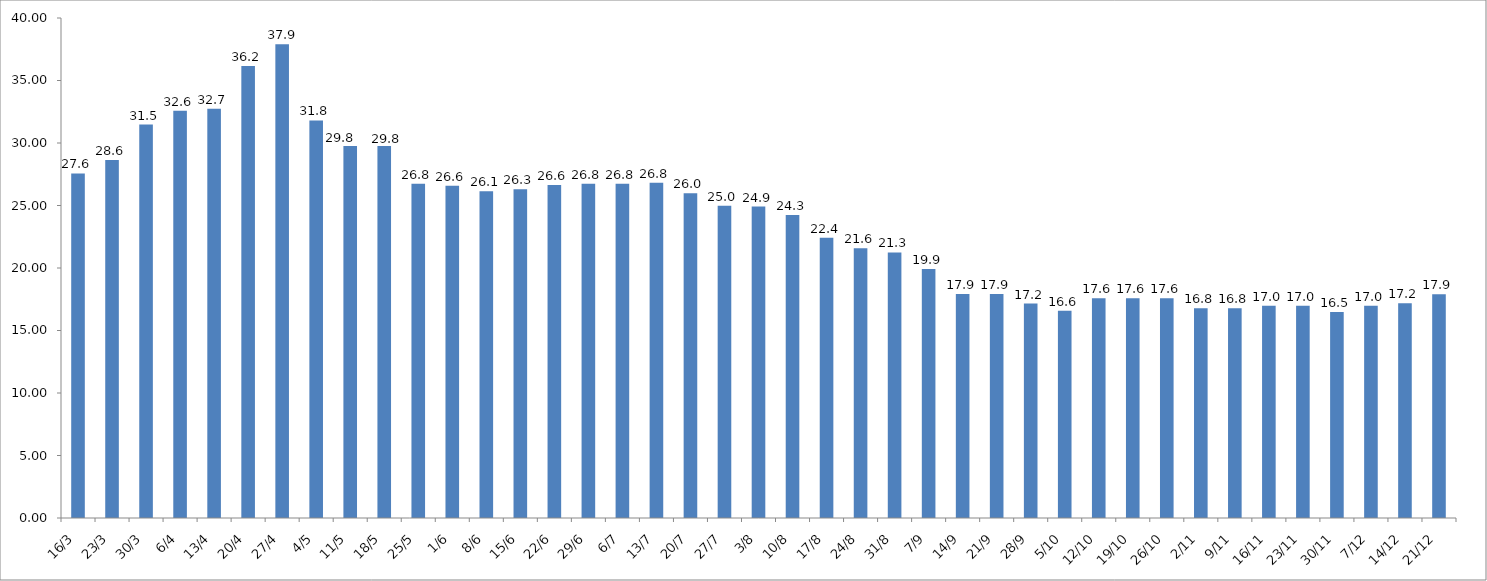
| Category | Series 0 |
|---|---|
| 2020-03-16 | 27.567 |
| 2020-03-23 | 28.642 |
| 2020-03-30 | 31.475 |
| 2020-04-06 | 32.575 |
| 2020-04-13 | 32.742 |
| 2020-04-20 | 36.15 |
| 2020-04-27 | 37.9 |
| 2020-05-04 | 31.808 |
| 2020-05-11 | 29.767 |
| 2020-05-18 | 29.767 |
| 2020-05-25 | 26.75 |
| 2020-06-01 | 26.583 |
| 2020-06-08 | 26.133 |
| 2020-06-15 | 26.3 |
| 2020-06-22 | 26.633 |
| 2020-06-29 | 26.75 |
| 2020-07-06 | 26.75 |
| 2020-07-13 | 26.817 |
| 2020-07-20 | 25.983 |
| 2020-07-27 | 24.983 |
| 2020-08-03 | 24.917 |
| 2020-08-10 | 24.25 |
| 2020-08-17 | 22.417 |
| 2020-08-24 | 21.583 |
| 2020-08-31 | 21.25 |
| 2020-09-07 | 19.917 |
| 2020-09-14 | 17.917 |
| 2020-09-21 | 17.917 |
| 2020-09-28 | 17.16 |
| 2020-10-05 | 16.58 |
| 2020-10-12 | 17.58 |
| 2020-10-19 | 17.58 |
| 2020-10-26 | 17.58 |
| 2020-11-02 | 16.775 |
| 2020-11-09 | 16.775 |
| 2020-11-16 | 16.975 |
| 2020-11-23 | 16.975 |
| 2020-11-30 | 16.475 |
| 2020-12-07 | 16.975 |
| 2020-12-14 | 17.18 |
| 2020-12-21 | 17.9 |